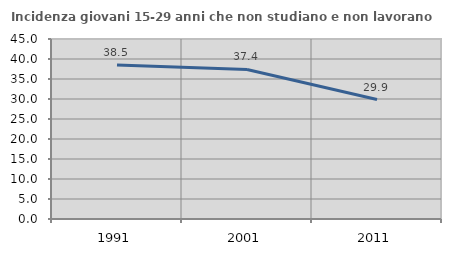
| Category | Incidenza giovani 15-29 anni che non studiano e non lavorano  |
|---|---|
| 1991.0 | 38.525 |
| 2001.0 | 37.396 |
| 2011.0 | 29.875 |